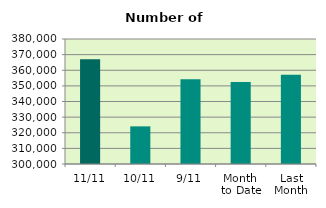
| Category | Series 0 |
|---|---|
| 11/11 | 366964 |
| 10/11 | 324092 |
| 9/11 | 354226 |
| Month 
to Date | 352459.778 |
| Last
Month | 357160.667 |